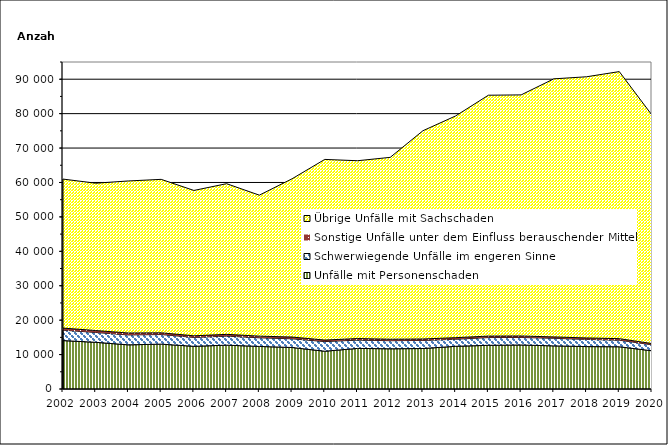
| Category | Unfälle mit Personenschaden | Schwerwiegende Unfälle im engeren Sinne | Sonstige Unfälle unter dem Einfluss berauschender Mittel 1) | Übrige Unfälle mit Sachschaden |
|---|---|---|---|---|
| 2002.0 | 14072 | 3028 | 595 | 43289 |
| 2003.0 | 13561 | 2866 | 559 | 42806 |
| 2004.0 | 12827 | 2877 | 564 | 44173 |
| 2005.0 | 13033 | 2795 | 499 | 44581 |
| 2006.0 | 12400 | 2588 | 466 | 42228 |
| 2007.0 | 12740 | 2628 | 507 | 43770 |
| 2008.0 | 12369 | 2510 | 481 | 40954 |
| 2009.0 | 12061 | 2528 | 502 | 45976 |
| 2010.0 | 10974 | 2803 | 441 | 52481 |
| 2011.0 | 11793 | 2419 | 443 | 51662 |
| 2012.0 | 11682 | 2353 | 422 | 52839 |
| 2013.0 | 11757 | 2357 | 414 | 60506 |
| 2014.0 | 12404 | 2056 | 448 | 64425 |
| 2015.0 | 12695 | 2249 | 427 | 69975 |
| 2016.0 | 12783 | 2187 | 433 | 70040 |
| 2017.0 | 12528 | 2214 | 385 | 74978 |
| 2018.0 | 12324 | 2084 | 421 | 75878 |
| 2019.0 | 12271 | 1914 | 438 | 77586 |
| 2020.0 | 11099 | 1748 | 347 | 66372 |